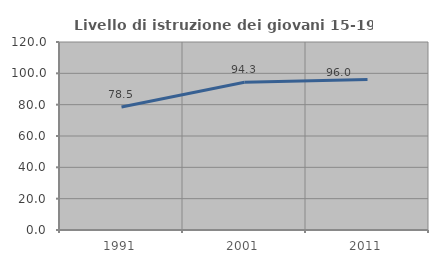
| Category | Livello di istruzione dei giovani 15-19 anni |
|---|---|
| 1991.0 | 78.491 |
| 2001.0 | 94.283 |
| 2011.0 | 96.025 |